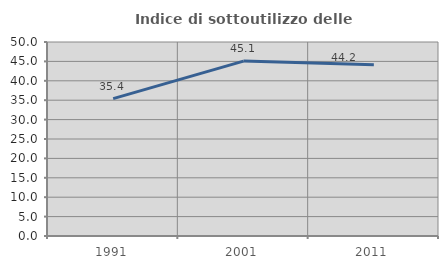
| Category | Indice di sottoutilizzo delle abitazioni  |
|---|---|
| 1991.0 | 35.409 |
| 2001.0 | 45.082 |
| 2011.0 | 44.156 |